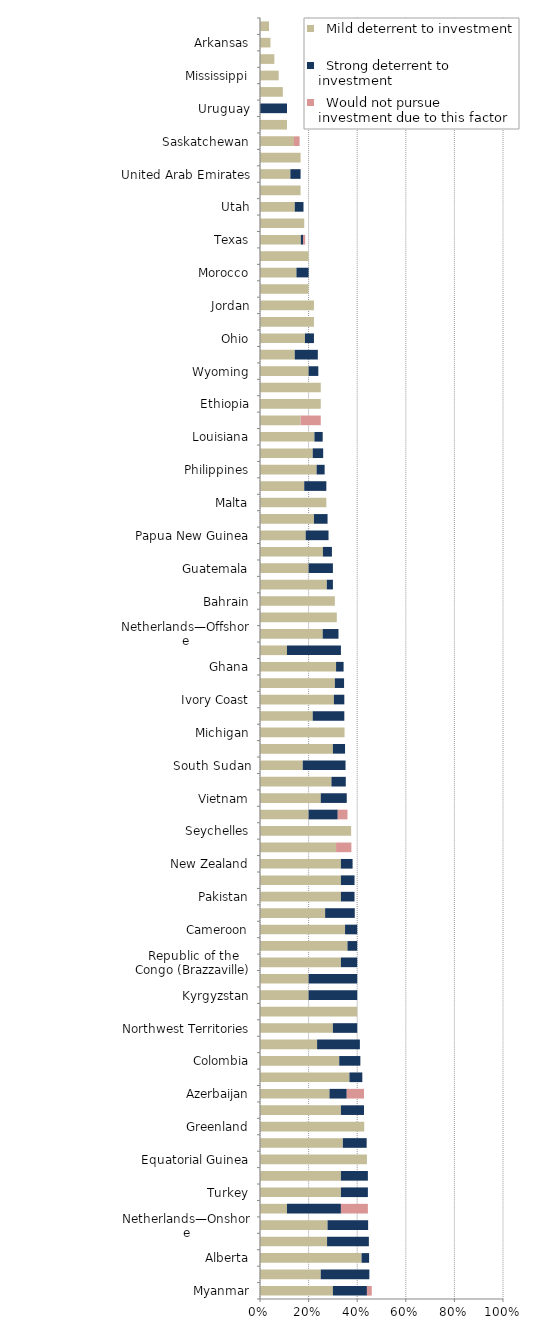
| Category |   Mild deterrent to investment |   Strong deterrent to investment |   Would not pursue investment due to this factor |
|---|---|---|---|
| Myanmar | 0.3 | 0.14 | 0.02 |
| Victoria | 0.25 | 0.2 | 0 |
| Alberta | 0.418 | 0.031 | 0 |
| Brazil—Offshore CC | 0.276 | 0.172 | 0 |
| Netherlands—Onshore | 0.278 | 0.167 | 0 |
| Tasmania | 0.111 | 0.222 | 0.111 |
| Turkey | 0.333 | 0.111 | 0 |
| Argentina—Tierra del Fuego | 0.333 | 0.111 | 0 |
| Equatorial Guinea | 0.44 | 0 | 0 |
| Gabon | 0.341 | 0.098 | 0 |
| Greenland | 0.429 | 0 | 0 |
| South Australia | 0.333 | 0.095 | 0 |
| Azerbaijan | 0.286 | 0.071 | 0.071 |
| West Virginia | 0.368 | 0.053 | 0 |
| Colombia | 0.326 | 0.087 | 0 |
| Argentina—Mendoza | 0.235 | 0.176 | 0 |
| Northwest Territories | 0.3 | 0.1 | 0 |
| Cyprus | 0.4 | 0 | 0 |
| Kyrgyzstan | 0.2 | 0.2 | 0 |
| Uzbekistan | 0.2 | 0.2 | 0 |
| Republic of the Congo (Brazzaville) | 0.333 | 0.067 | 0 |
| Brunei | 0.36 | 0.04 | 0 |
| Cameroon | 0.35 | 0.05 | 0 |
| Malaysia | 0.268 | 0.122 | 0 |
| Pakistan | 0.333 | 0.056 | 0 |
| Democratic Republic of the Congo (Kinshasa) | 0.333 | 0.056 | 0 |
| New Zealand | 0.333 | 0.048 | 0 |
| Nova Scotia | 0.313 | 0 | 0.063 |
| Seychelles | 0.375 | 0 | 0 |
| Argentina—Neuquen | 0.2 | 0.12 | 0.04 |
| Vietnam | 0.25 | 0.107 | 0 |
| Chad | 0.294 | 0.059 | 0 |
| South Sudan | 0.176 | 0.176 | 0 |
| Yemen | 0.3 | 0.05 | 0 |
| Michigan | 0.348 | 0 | 0 |
| New Mexico | 0.217 | 0.13 | 0 |
| Ivory Coast | 0.304 | 0.043 | 0 |
| Denmark | 0.308 | 0.038 | 0 |
| Ghana | 0.313 | 0.031 | 0 |
| Syria | 0.111 | 0.222 | 0 |
| Netherlands—Offshore | 0.258 | 0.065 | 0 |
| Namibia | 0.316 | 0 | 0 |
| Bahrain | 0.308 | 0 | 0 |
| Montana | 0.275 | 0.025 | 0 |
| Guatemala | 0.2 | 0.1 | 0 |
| Oman | 0.259 | 0.037 | 0 |
| Papua New Guinea | 0.188 | 0.094 | 0 |
| Illinois | 0.222 | 0.056 | 0 |
| Malta | 0.273 | 0 | 0 |
| Mauritania | 0.182 | 0.091 | 0 |
| Philippines | 0.233 | 0.033 | 0 |
| Trinidad and Tobago | 0.217 | 0.043 | 0 |
| Louisiana | 0.224 | 0.034 | 0 |
| Manitoba | 0.167 | 0 | 0.083 |
| Ethiopia | 0.25 | 0 | 0 |
| Chile | 0.25 | 0 | 0 |
| Wyoming | 0.2 | 0.04 | 0 |
| Qatar | 0.143 | 0.095 | 0 |
| Ohio | 0.185 | 0.037 | 0 |
| Faroe Islands | 0.222 | 0 | 0 |
| Jordan | 0.222 | 0 | 0 |
| Newfoundland & Labrador | 0.2 | 0 | 0 |
| Morocco | 0.15 | 0.05 | 0 |
| French Guiana | 0.2 | 0 | 0 |
| Texas | 0.168 | 0.009 | 0.009 |
| Suriname | 0.182 | 0 | 0 |
| Utah | 0.143 | 0.036 | 0 |
| Georgia | 0.167 | 0 | 0 |
| United Arab Emirates | 0.125 | 0.042 | 0 |
| Guyana | 0.167 | 0 | 0 |
| Saskatchewan | 0.14 | 0 | 0.023 |
| Kansas | 0.111 | 0 | 0 |
| Uruguay | 0 | 0.111 | 0 |
| North Dakota | 0.094 | 0 | 0 |
| Mississippi | 0.077 | 0 | 0 |
| Alabama | 0.059 | 0 | 0 |
| Arkansas | 0.043 | 0 | 0 |
| Oklahoma | 0.037 | 0 | 0 |